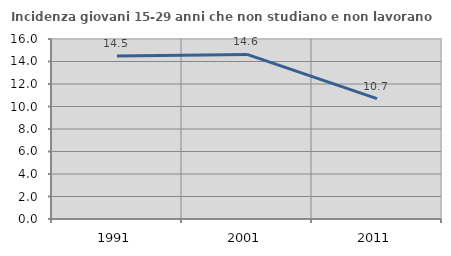
| Category | Incidenza giovani 15-29 anni che non studiano e non lavorano  |
|---|---|
| 1991.0 | 14.48 |
| 2001.0 | 14.627 |
| 2011.0 | 10.702 |